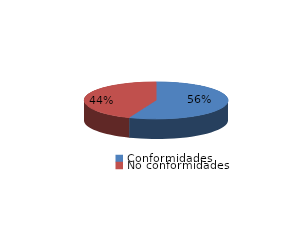
| Category | Series 0 |
|---|---|
| Conformidades | 9884 |
| No conformidades | 7765 |